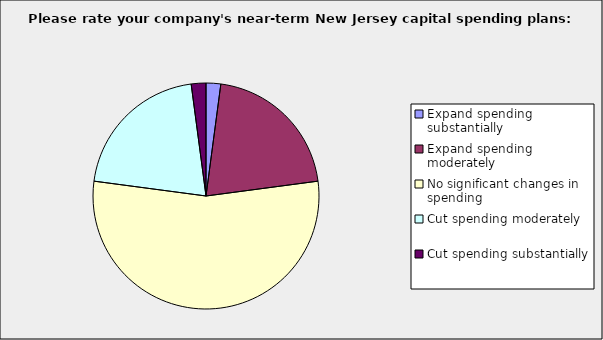
| Category | Series 0 |
|---|---|
| Expand spending substantially | 0.021 |
| Expand spending moderately | 0.208 |
| No significant changes in spending | 0.542 |
| Cut spending moderately | 0.208 |
| Cut spending substantially | 0.021 |